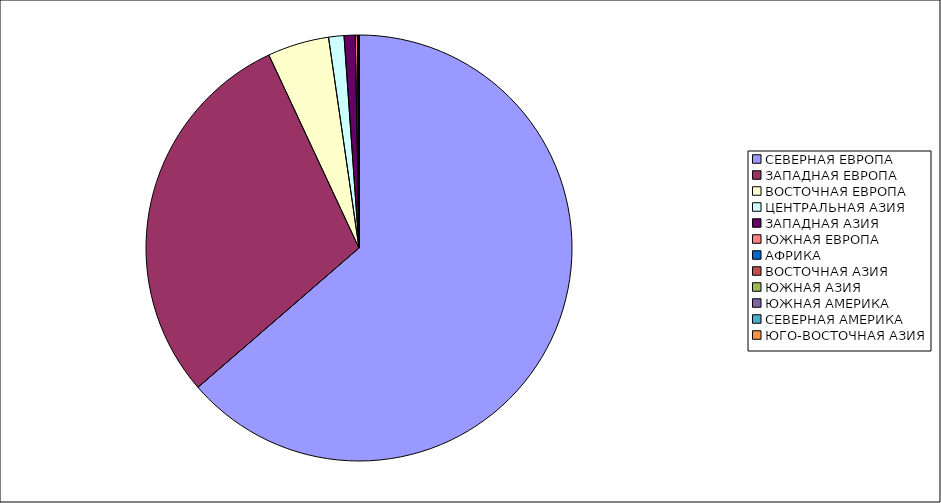
| Category | Оборот |
|---|---|
| СЕВЕРНАЯ ЕВРОПА | 63.646 |
| ЗАПАДНАЯ ЕВРОПА | 29.399 |
| ВОСТОЧНАЯ ЕВРОПА | 4.666 |
| ЦЕНТРАЛЬНАЯ АЗИЯ | 1.166 |
| ЗАПАДНАЯ АЗИЯ | 0.842 |
| ЮЖНАЯ ЕВРОПА | 0.162 |
| АФРИКА | 0.063 |
| ВОСТОЧНАЯ АЗИЯ | 0.022 |
| ЮЖНАЯ АЗИЯ | 0.018 |
| ЮЖНАЯ АМЕРИКА | 0.014 |
| СЕВЕРНАЯ АМЕРИКА | 0.002 |
| ЮГО-ВОСТОЧНАЯ АЗИЯ | 0 |